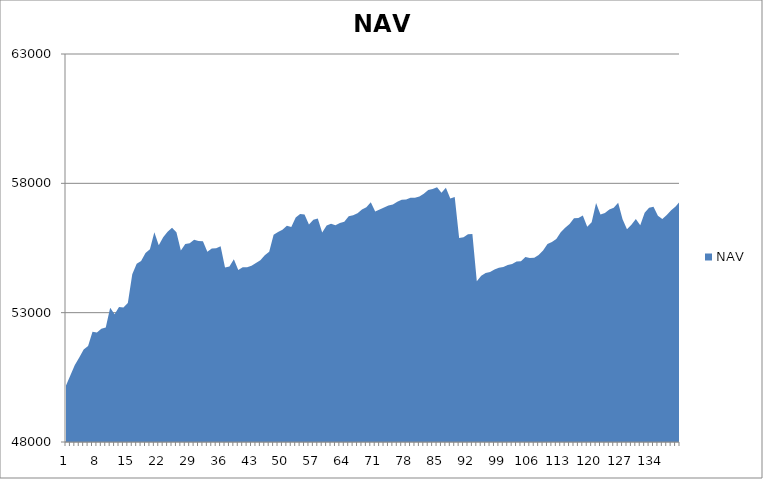
| Category | NAV |
|---|---|
| 0 | 50185.185 |
| 1 | 50585.185 |
| 2 | 50973.977 |
| 3 | 51265.977 |
| 4 | 51576.741 |
| 5 | 51711.523 |
| 6 | 52262.893 |
| 7 | 52230.24 |
| 8 | 52381.556 |
| 9 | 52425.915 |
| 10 | 53192.581 |
| 11 | 52939.146 |
| 12 | 53220.069 |
| 13 | 53197.341 |
| 14 | 53369.61 |
| 15 | 54480.721 |
| 16 | 54888.365 |
| 17 | 55001.902 |
| 18 | 55308.308 |
| 19 | 55448.308 |
| 20 | 56110.305 |
| 21 | 55610.305 |
| 22 | 55916.954 |
| 23 | 56129.798 |
| 24 | 56279.798 |
| 25 | 56105.301 |
| 26 | 55401.645 |
| 27 | 55657.201 |
| 28 | 55686.925 |
| 29 | 55823.001 |
| 30 | 55769.596 |
| 31 | 55759.375 |
| 32 | 55350.284 |
| 33 | 55480.284 |
| 34 | 55492.498 |
| 35 | 55570.42 |
| 36 | 54746.89 |
| 37 | 54783.7 |
| 38 | 55066.459 |
| 39 | 54651.074 |
| 40 | 54754.078 |
| 41 | 54760.213 |
| 42 | 54816.924 |
| 43 | 54917.296 |
| 44 | 55025.73 |
| 45 | 55220.535 |
| 46 | 55353.465 |
| 47 | 56009.309 |
| 48 | 56118.959 |
| 49 | 56205.212 |
| 50 | 56362.876 |
| 51 | 56307.394 |
| 52 | 56678.935 |
| 53 | 56813.264 |
| 54 | 56799.502 |
| 55 | 56409.112 |
| 56 | 56596.44 |
| 57 | 56640.493 |
| 58 | 56102.227 |
| 59 | 56370.449 |
| 60 | 56434.248 |
| 61 | 56376.841 |
| 62 | 56464.524 |
| 63 | 56518.022 |
| 64 | 56724.747 |
| 65 | 56770.361 |
| 66 | 56848.099 |
| 67 | 56992.896 |
| 68 | 57073.571 |
| 69 | 57266.481 |
| 70 | 56908.016 |
| 71 | 56984.939 |
| 72 | 57069.276 |
| 73 | 57147.627 |
| 74 | 57179.83 |
| 75 | 57291.17 |
| 76 | 57366.35 |
| 77 | 57371.599 |
| 78 | 57439.215 |
| 79 | 57440.895 |
| 80 | 57490.895 |
| 81 | 57593.679 |
| 82 | 57746.643 |
| 83 | 57785.413 |
| 84 | 57849.748 |
| 85 | 57639.346 |
| 86 | 57828.82 |
| 87 | 57417.055 |
| 88 | 57471.335 |
| 89 | 55888.376 |
| 90 | 55913.907 |
| 91 | 56031.989 |
| 92 | 56044.711 |
| 93 | 54210.631 |
| 94 | 54422.612 |
| 95 | 54536.647 |
| 96 | 54575.903 |
| 97 | 54670.229 |
| 98 | 54737.367 |
| 99 | 54762.386 |
| 100 | 54842.923 |
| 101 | 54881.385 |
| 102 | 54978.816 |
| 103 | 54991.283 |
| 104 | 55149.699 |
| 105 | 55109.498 |
| 106 | 55121.656 |
| 107 | 55227.569 |
| 108 | 55405.15 |
| 109 | 55650.183 |
| 110 | 55733.424 |
| 111 | 55846.244 |
| 112 | 56110.95 |
| 113 | 56283.172 |
| 114 | 56430.541 |
| 115 | 56648.489 |
| 116 | 56663.919 |
| 117 | 56752.272 |
| 118 | 56318.108 |
| 119 | 56496.442 |
| 120 | 57240.145 |
| 121 | 56797.081 |
| 122 | 56857.303 |
| 123 | 56985.874 |
| 124 | 57053.805 |
| 125 | 57249.117 |
| 126 | 56612.311 |
| 127 | 56221.507 |
| 128 | 56394.346 |
| 129 | 56622.008 |
| 130 | 56375.255 |
| 131 | 56862.384 |
| 132 | 57060.137 |
| 133 | 57099.524 |
| 134 | 56750.37 |
| 135 | 56622.71 |
| 136 | 56780.605 |
| 137 | 56961.84 |
| 138 | 57105.4 |
| 139 | 57301.96 |